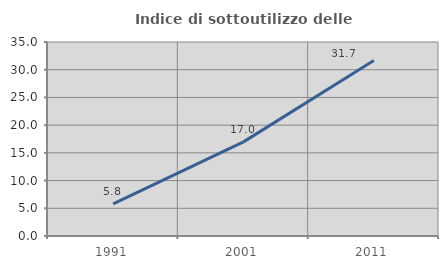
| Category | Indice di sottoutilizzo delle abitazioni  |
|---|---|
| 1991.0 | 5.797 |
| 2001.0 | 16.981 |
| 2011.0 | 31.667 |